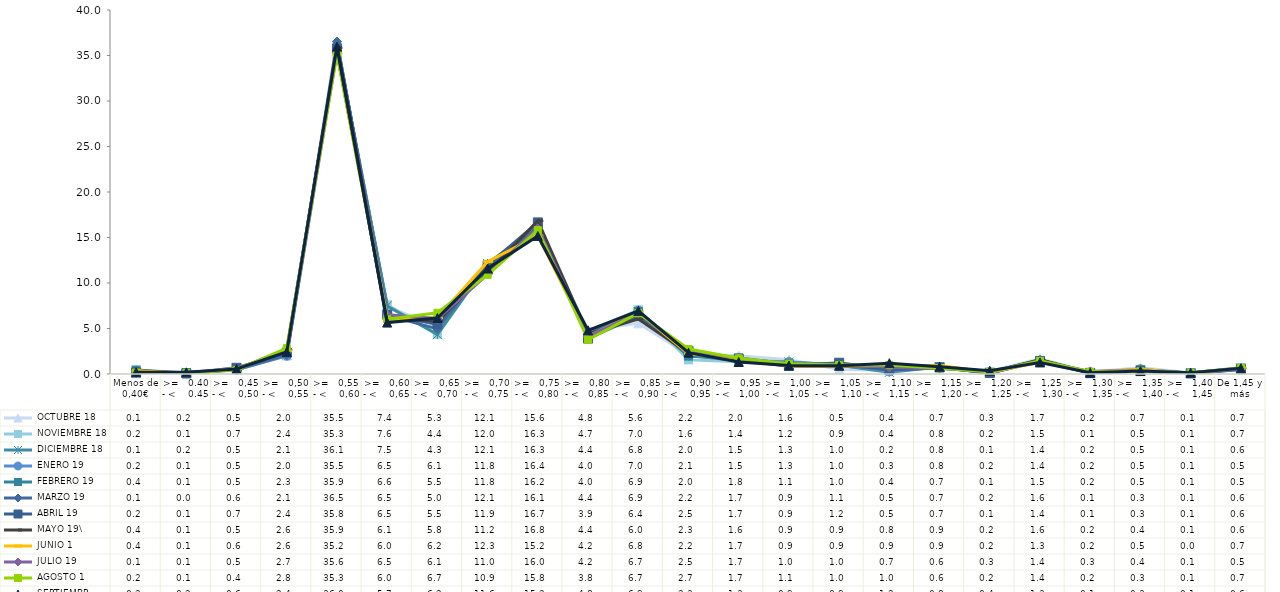
| Category |  OCTUBRE 18 |  NOVIEMBRE 18 |  DICIEMBRE 18 |  ENERO 19 |  FEBRERO 19 |  MARZO 19 |  ABRIL 19 |  MAYO 19\ |  JUNIO 1 |  JULIO 19 |  AGOSTO 1 |  SEPTIEMBR |
|---|---|---|---|---|---|---|---|---|---|---|---|---|
| Menos de 0,40€ | 0.08 | 0.16 | 0.07 | 0.2 | 0.44 | 0.13 | 0.18 | 0.39 | 0.35 | 0.14 | 0.16 | 0.2 |
| >=   0.40 - <    0.45 | 0.15 | 0.14 | 0.18 | 0.08 | 0.12 | 0.03 | 0.06 | 0.05 | 0.07 | 0.09 | 0.11 | 0.18 |
| >=   0,45 - <    0,50 | 0.53 | 0.66 | 0.47 | 0.46 | 0.52 | 0.56 | 0.68 | 0.52 | 0.6 | 0.53 | 0.44 | 0.56 |
| >=   0,50 - <    0,55 | 2.02 | 2.35 | 2.08 | 2 | 2.28 | 2.09 | 2.36 | 2.64 | 2.57 | 2.65 | 2.84 | 2.43 |
| >=   0,55 - <    0,60 | 35.48 | 35.27 | 36.11 | 35.5 | 35.91 | 36.53 | 35.75 | 35.85 | 35.24 | 35.64 | 35.29 | 35.98 |
| >=   0,60 - <    0,65 | 7.36 | 7.6 | 7.48 | 6.48 | 6.55 | 6.45 | 6.51 | 6.08 | 6.02 | 6.5 | 6.02 | 5.65 |
| >=   0,65 - <   0,70 | 5.26 | 4.37 | 4.33 | 6.09 | 5.48 | 4.96 | 5.48 | 5.82 | 6.17 | 6.06 | 6.73 | 6.15 |
| >=   0,70 - <   0,75 | 12.06 | 12.03 | 12.14 | 11.8 | 11.8 | 12.07 | 11.94 | 11.15 | 12.34 | 10.95 | 10.9 | 11.59 |
| >=   0,75 - <   0,80 | 15.63 | 16.31 | 16.26 | 16.37 | 16.24 | 16.05 | 16.66 | 16.82 | 15.2 | 16.01 | 15.81 | 15.17 |
| >=   0,80 - <   0,85 | 4.81 | 4.65 | 4.4 | 4.02 | 4.03 | 4.37 | 3.89 | 4.39 | 4.15 | 4.17 | 3.76 | 4.8 |
| >=   0,85 - <   0,90 | 5.57 | 7.04 | 6.84 | 6.98 | 6.85 | 6.9 | 6.39 | 6.03 | 6.8 | 6.7 | 6.69 | 6.93 |
| >=   0,90 - <    0,95 | 2.15 | 1.56 | 2.04 | 2.1 | 1.96 | 2.19 | 2.54 | 2.29 | 2.23 | 2.54 | 2.74 | 2.34 |
| >=   0,95 - <   1,00 | 2.01 | 1.35 | 1.45 | 1.54 | 1.76 | 1.7 | 1.69 | 1.55 | 1.73 | 1.74 | 1.72 | 1.32 |
| >=   1,00 - <   1,05 | 1.58 | 1.18 | 1.33 | 1.31 | 1.14 | 0.93 | 0.88 | 0.85 | 0.89 | 1.01 | 1.13 | 0.93 |
| >=   1,05 - <    1,10 | 0.5 | 0.9 | 0.95 | 1.02 | 1.01 | 1.08 | 1.24 | 0.86 | 0.89 | 1 | 0.99 | 0.9 |
| >=   1,10 - <   1,15 | 0.42 | 0.44 | 0.18 | 0.29 | 0.42 | 0.48 | 0.46 | 0.78 | 0.9 | 0.73 | 1 | 1.19 |
| >=   1,15 - <    1,20 | 0.71 | 0.79 | 0.78 | 0.79 | 0.71 | 0.66 | 0.73 | 0.86 | 0.93 | 0.6 | 0.63 | 0.79 |
| >=   1,20 - <    1,25 | 0.3 | 0.23 | 0.09 | 0.2 | 0.12 | 0.19 | 0.11 | 0.21 | 0.2 | 0.29 | 0.24 | 0.35 |
| >=   1,25 - <    1,30 | 1.68 | 1.5 | 1.43 | 1.43 | 1.46 | 1.55 | 1.41 | 1.55 | 1.29 | 1.39 | 1.44 | 1.27 |
| >=   1,30 - <    1,35 | 0.21 | 0.1 | 0.15 | 0.18 | 0.18 | 0.11 | 0.09 | 0.17 | 0.22 | 0.29 | 0.24 | 0.14 |
| >=   1,35 - <    1,40 | 0.68 | 0.5 | 0.45 | 0.53 | 0.46 | 0.3 | 0.33 | 0.36 | 0.52 | 0.35 | 0.29 | 0.32 |
| >=   1,40 - <    1,45 | 0.14 | 0.11 | 0.12 | 0.08 | 0.06 | 0.07 | 0.06 | 0.11 | 0.03 | 0.09 | 0.13 | 0.14 |
| De 1,45 y más | 0.67 | 0.72 | 0.63 | 0.5 | 0.49 | 0.57 | 0.56 | 0.64 | 0.66 | 0.54 | 0.67 | 0.63 |